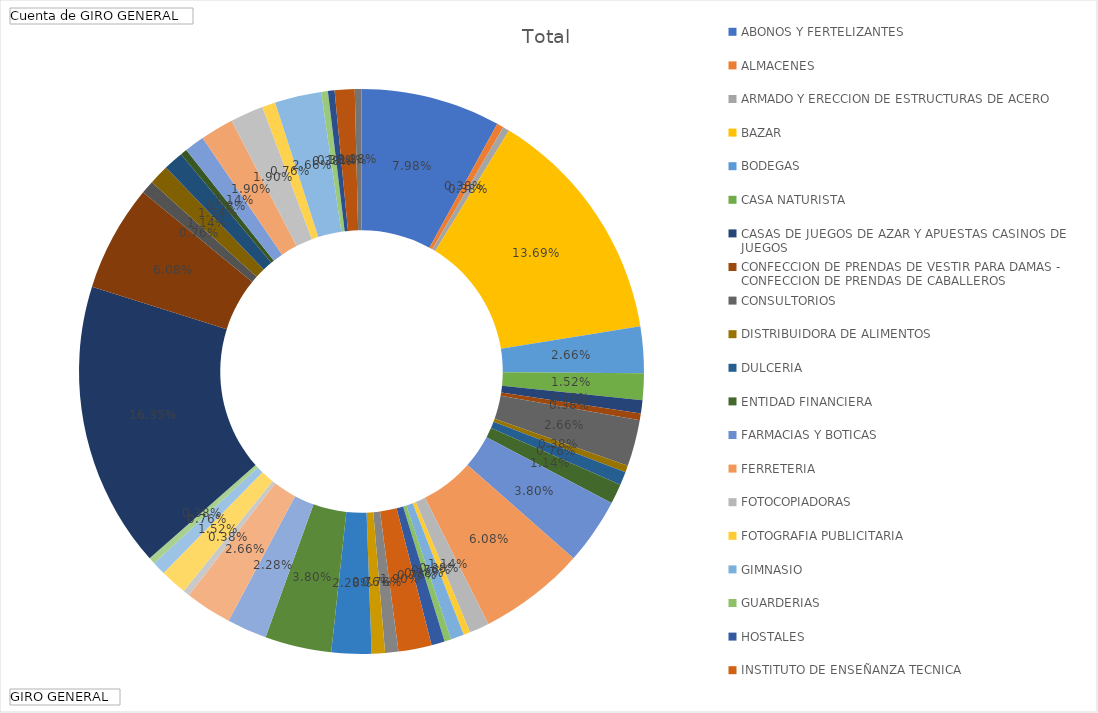
| Category | Total |
|---|---|
| ABONOS Y FERTELIZANTES | 0.08 |
| ALMACENES | 0.004 |
| ARMADO Y ERECCION DE ESTRUCTURAS DE ACERO | 0.004 |
| BAZAR | 0.137 |
| BODEGAS | 0.027 |
| CASA NATURISTA | 0.015 |
| CASAS DE JUEGOS DE AZAR Y APUESTAS CASINOS DE JUEGOS | 0.008 |
| CONFECCION DE PRENDAS DE VESTIR PARA DAMAS - CONFECCION DE PRENDAS DE CABALLEROS | 0.004 |
| CONSULTORIOS | 0.027 |
| DISTRIBUIDORA DE ALIMENTOS | 0.004 |
| DULCERIA | 0.008 |
| ENTIDAD FINANCIERA | 0.011 |
| FARMACIAS Y BOTICAS | 0.038 |
| FERRETERIA | 0.061 |
| FOTOCOPIADORAS | 0.011 |
| FOTOGRAFIA PUBLICITARIA | 0.004 |
| GIMNASIO | 0.008 |
| GUARDERIAS | 0.004 |
| HOSTALES | 0.008 |
| INSTITUTO DE ENSEÑANZA TECNICA, SECUNDARIA Y PRE ESCOLAR | 0.019 |
| JUEGOS ELECTRONICOS | 0.008 |
| JUGUETERIA | 0.008 |
| MANT. Y REP. DE EQUIPOS INFORMATICOS | 0.023 |
| MINIMARKET | 0.038 |
| MUEBLERIA | 0.023 |
| OTROS GIROS COMERCIALES | 0.027 |
| PANADERIA | 0.004 |
| PLAYA DE ESTACIONAMIENTO | 0.015 |
| RELOJERIAS Y JOYERIAS | 0.008 |
| REPARACION DE ELECTRODOMESTICOS | 0.004 |
| RESTAURANTES | 0.163 |
| SALONES DE BELLEZA | 0.061 |
| SERVICIO DE LAVADO DE VEHICULOS | 0.008 |
| SERVICIOS DE LIMPIEZA | 0.011 |
| SERVICIOS PROFESIONALES | 0.011 |
| TALLER DE MECANICA | 0.004 |
| VENTA AL POR MAYOR DE BEBIDAS Y TABACO | 0.011 |
| VENTA DE APARATOS TELEFONICOS | 0.019 |
| VENTA DE CALZADO | 0.019 |
| VENTA DE ELECTRODOMESTICOS | 0.008 |
| VENTA DE MONTURAS DE LENTES | 0.027 |
| VENTA DE PRENDAS DE VESTIR | 0.004 |
| VENTA DE REPUESTOS PARA MOTOCICLETAS - REPARACION DE OTROS TIPO DE MAQUINARIAS DE USO GENERAL | 0.004 |
| VETERINARIA | 0.011 |
| VIDRIERIAS | 0.004 |